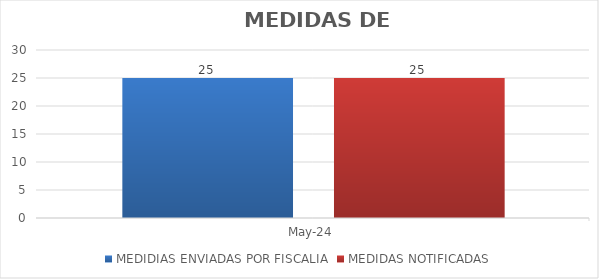
| Category | MEDIDIAS ENVIADAS POR FISCALIA | MEDIDAS NOTIFICADAS |
|---|---|---|
| 2024-05-01 | 25 | 25 |